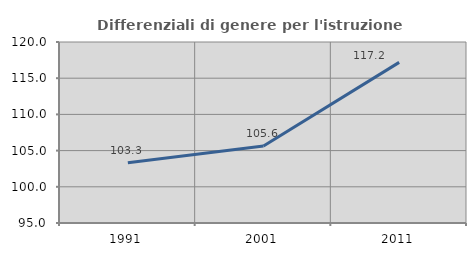
| Category | Differenziali di genere per l'istruzione superiore |
|---|---|
| 1991.0 | 103.319 |
| 2001.0 | 105.634 |
| 2011.0 | 117.188 |